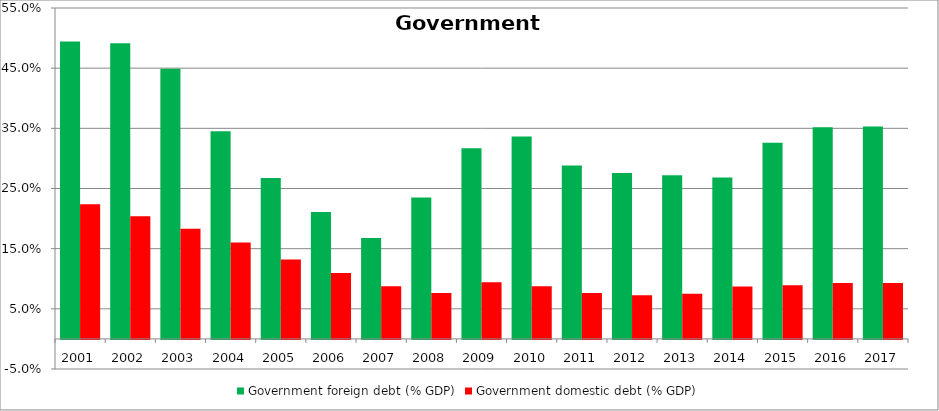
| Category | Government foreign debt (% GDP) | Government domestic debt (% GDP) |
|---|---|---|
| 2001.0 | 0.494 | 0.224 |
| 2002.0 | 0.491 | 0.204 |
| 2003.0 | 0.449 | 0.183 |
| 2004.0 | 0.345 | 0.16 |
| 2005.0 | 0.268 | 0.132 |
| 2006.0 | 0.211 | 0.11 |
| 2007.0 | 0.168 | 0.088 |
| 2008.0 | 0.235 | 0.076 |
| 2009.0 | 0.317 | 0.094 |
| 2010.0 | 0.336 | 0.088 |
| 2011.0 | 0.288 | 0.077 |
| 2012.0 | 0.276 | 0.072 |
| 2013.0 | 0.272 | 0.075 |
| 2014.0 | 0.268 | 0.087 |
| 2015.0 | 0.326 | 0.089 |
| 2016.0 | 0.352 | 0.093 |
| 2017.0 | 0.353 | 0.093 |